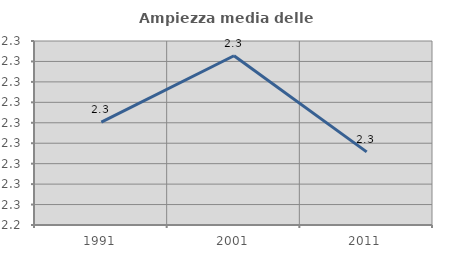
| Category | Ampiezza media delle famiglie |
|---|---|
| 1991.0 | 2.29 |
| 2001.0 | 2.323 |
| 2011.0 | 2.276 |